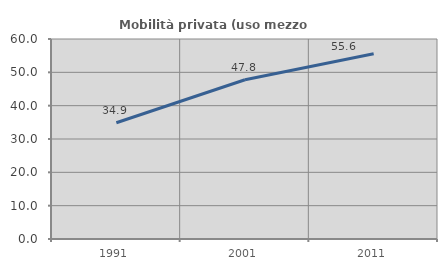
| Category | Mobilità privata (uso mezzo privato) |
|---|---|
| 1991.0 | 34.866 |
| 2001.0 | 47.783 |
| 2011.0 | 55.556 |